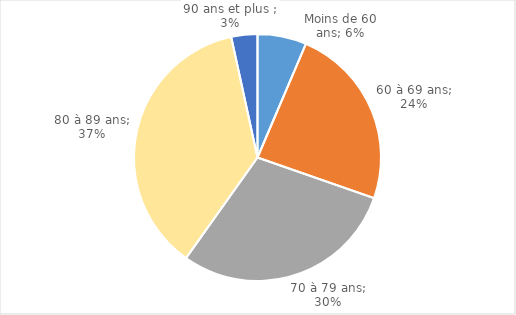
| Category | Series 0 |
|---|---|
| Moins de 60 ans | 0.064 |
| 60 à 69 ans | 0.239 |
| 70 à 79 ans | 0.295 |
| 80 à 89 ans | 0.368 |
| 90 ans et plus  | 0.034 |